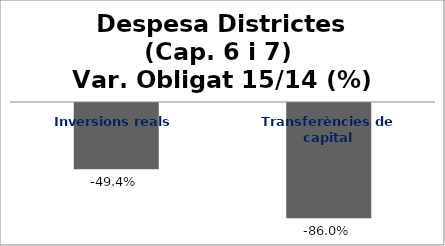
| Category | Series 0 |
|---|---|
| Inversions reals | -0.494 |
| Transferències de capital | -0.86 |